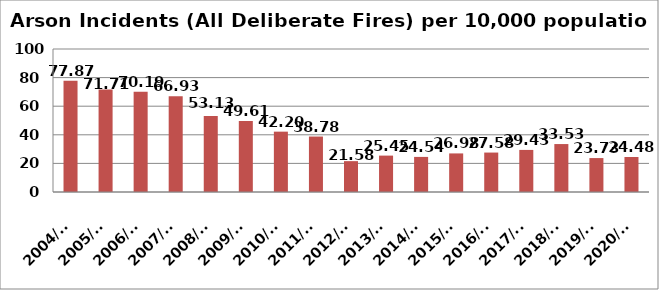
| Category | Series 0 |
|---|---|
| 2004/05 | 77.87 |
| 2005/06 | 71.71 |
| 2006/07 | 70.19 |
| 2007/08 | 66.93 |
| 2008/09 | 53.13 |
| 2009/10 | 49.61 |
| 2010/11 | 42.2 |
| 2011/12 | 38.78 |
| 2012/13 | 21.58 |
| 2013/14 | 25.45 |
| 2014/15 | 24.54 |
| 2015/16 | 26.98 |
| 2016/17 | 27.58 |
| 2017/18 | 29.43 |
| 2018/19 | 33.53 |
| 2019/20 | 23.73 |
| 2020/21 | 24.48 |